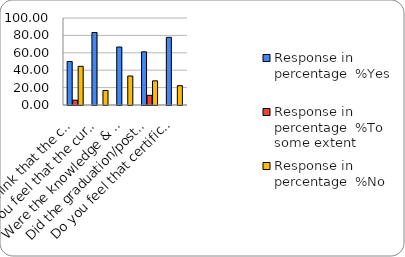
| Category | Response in percentage  |
|---|---|
| Do you think that the curriculum which you had during your graduation/post graduation has provided you with the knowledge & skills necessary to get employed/Self-employed or start own business? | 44.444 |
| Do you feel that the curriculum you studied is helpful in progression to higher studies? | 16.667 |
| Were the knowledge & skills acquired through the curriculum useful to you while working on the job?   | 33.333 |
| Did the graduation/post-graduation programme bring about any attitudinal and behavioural change in you? | 27.778 |
| Do you feel that certificate/ diploma courses offered by the college in addition to the curriculum lead to better career prospects? | 22.222 |